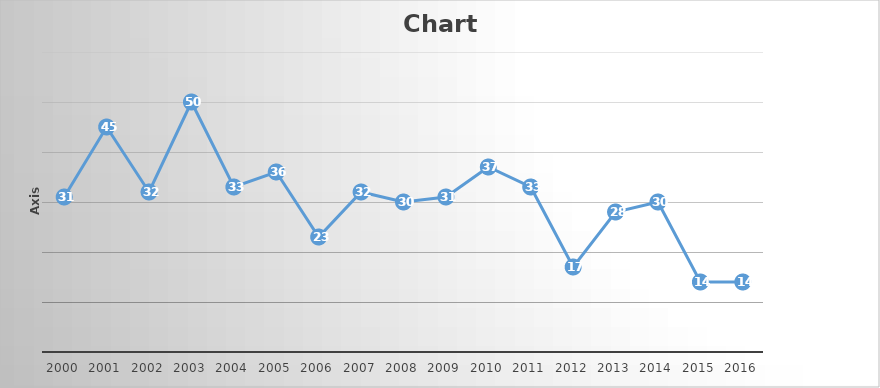
| Category | Series 0 |
|---|---|
| 2000.0 | 31 |
| 2001.0 | 45 |
| 2002.0 | 32 |
| 2003.0 | 50 |
| 2004.0 | 33 |
| 2005.0 | 36 |
| 2006.0 | 23 |
| 2007.0 | 32 |
| 2008.0 | 30 |
| 2009.0 | 31 |
| 2010.0 | 37 |
| 2011.0 | 33 |
| 2012.0 | 17 |
| 2013.0 | 28 |
| 2014.0 | 30 |
| 2015.0 | 14 |
| 2016.0 | 14 |